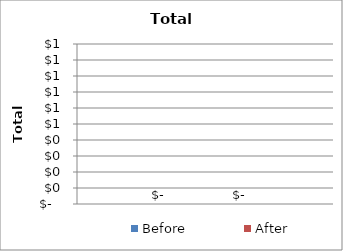
| Category | Before | After |
|---|---|---|
| 0 | 0 | 0 |